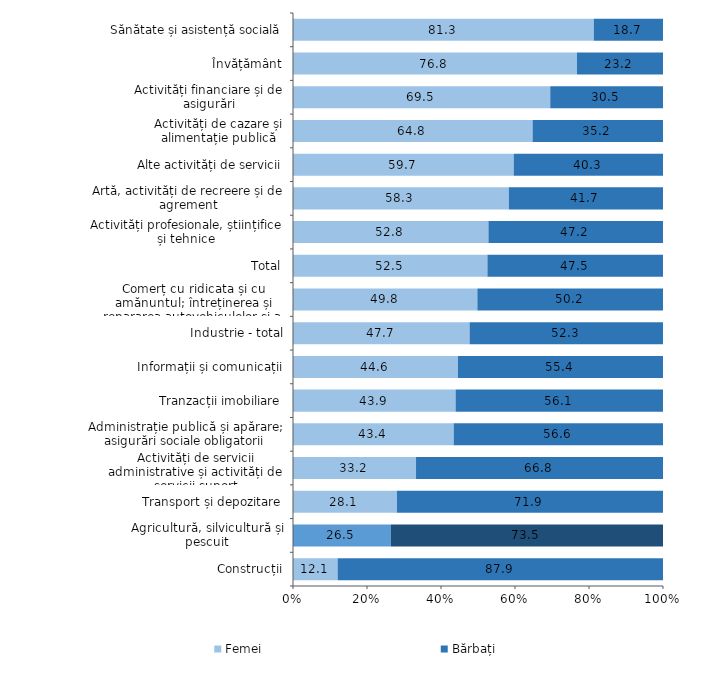
| Category | Femei | Bărbați |
|---|---|---|
| Construcții | 12.066 | 87.934 |
| Agricultură, silvicultură și pescuit | 26.477 | 73.523 |
| Transport și depozitare | 28.099 | 71.901 |
| Activități de servicii administrative și activități de servicii suport | 33.249 | 66.751 |
| Administrație publică și apărare; asigurări sociale obligatorii | 43.426 | 56.574 |
| Tranzacții imobiliare | 43.948 | 56.052 |
| Informații și comunicații | 44.574 | 55.426 |
| Industrie - total | 47.734 | 52.266 |
| Comerț cu ridicata și cu amănuntul; întreținerea și repararea autovehiculelor și a motocicletelor | 49.828 | 50.172 |
| Total | 52.548 | 47.452 |
| Activități profesionale, științifice și tehnice | 52.825 | 47.175 |
| Artă, activități de recreere și de agrement | 58.332 | 41.668 |
| Alte activități de servicii | 59.663 | 40.337 |
| Activități de cazare și alimentație publică | 64.752 | 35.248 |
| Activități financiare și de asigurări | 69.524 | 30.476 |
| Învățământ | 76.751 | 23.249 |
| Sănătate și asistență socială | 81.288 | 18.712 |